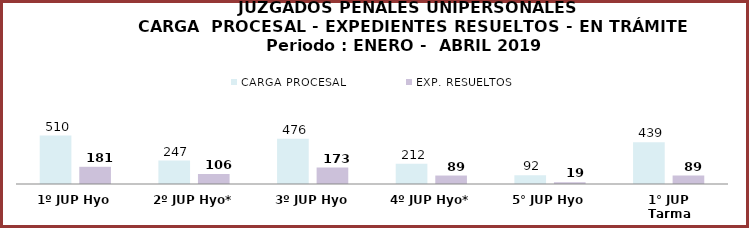
| Category | CARGA PROCESAL | EXP. RESUELTOS |
|---|---|---|
| 1º JUP Hyo | 510 | 181 |
| 2º JUP Hyo* | 247 | 106 |
| 3º JUP Hyo | 476 | 173 |
| 4º JUP Hyo* | 212 | 89 |
| 5° JUP Hyo | 92 | 19 |
| 1° JUP Tarma | 439 | 89 |